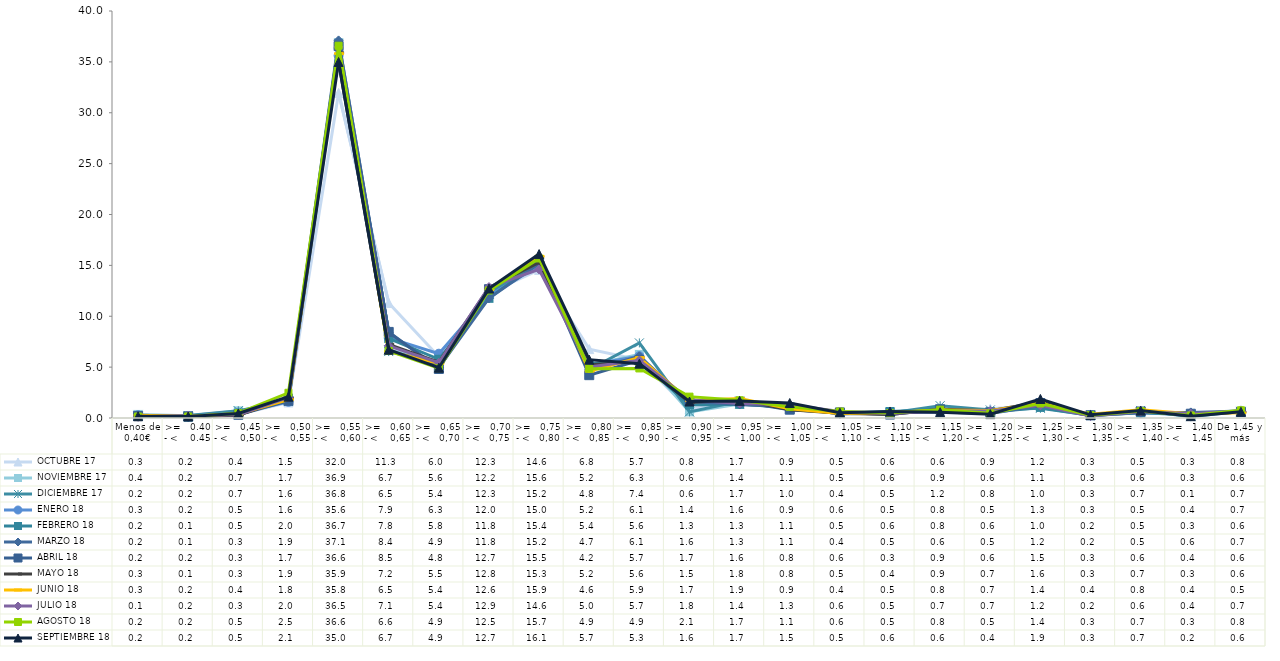
| Category |  OCTUBRE 17 |  NOVIEMBRE 17 |  DICIEMBRE 17 |  ENERO 18 |  FEBRERO 18 |  MARZO 18 |  ABRIL 18 |  MAYO 18 |  JUNIO 18 |  JULIO 18 |  AGOSTO 18 |  SEPTIEMBRE 18 |
|---|---|---|---|---|---|---|---|---|---|---|---|---|
| Menos de 0,40€ | 0.25 | 0.35 | 0.16 | 0.27 | 0.23 | 0.24 | 0.2 | 0.25 | 0.28 | 0.12 | 0.15 | 0.17 |
| >=   0.40 - <    0.45 | 0.22 | 0.21 | 0.24 | 0.17 | 0.08 | 0.1 | 0.16 | 0.11 | 0.17 | 0.22 | 0.15 | 0.15 |
| >=   0,45 - <    0,50 | 0.37 | 0.7 | 0.71 | 0.47 | 0.47 | 0.33 | 0.32 | 0.28 | 0.4 | 0.33 | 0.47 | 0.45 |
| >=   0,50 - <    0,55 | 1.53 | 1.68 | 1.63 | 1.59 | 1.95 | 1.9 | 1.69 | 1.94 | 1.81 | 2.02 | 2.48 | 2.09 |
| >=   0,55 - <    0,60 | 31.95 | 36.88 | 36.78 | 35.62 | 36.65 | 37.11 | 36.55 | 35.9 | 35.81 | 36.45 | 36.59 | 34.99 |
| >=   0,60 - <    0,65 | 11.31 | 6.69 | 6.53 | 7.87 | 7.82 | 8.37 | 8.46 | 7.24 | 6.54 | 7.09 | 6.6 | 6.71 |
| >=   0,65 - <   0,70 | 6.02 | 5.56 | 5.41 | 6.32 | 5.77 | 4.94 | 4.82 | 5.48 | 5.37 | 5.43 | 4.89 | 4.94 |
| >=   0,70 - <   0,75 | 12.29 | 12.24 | 12.31 | 12 | 11.76 | 11.77 | 12.66 | 12.8 | 12.63 | 12.87 | 12.53 | 12.72 |
| >=   0,75 - <   0,80 | 14.55 | 15.56 | 15.2 | 14.99 | 15.39 | 15.19 | 15.48 | 15.29 | 15.89 | 14.6 | 15.68 | 16.11 |
| >=   0,80 - <   0,85 | 6.77 | 5.19 | 4.77 | 5.21 | 5.36 | 4.73 | 4.21 | 5.24 | 4.61 | 5.02 | 4.85 | 5.73 |
| >=   0,85 - <   0,90 | 5.71 | 6.25 | 7.38 | 6.08 | 5.62 | 6.06 | 5.68 | 5.56 | 5.93 | 5.66 | 4.87 | 5.34 |
| >=   0,90 - <    0,95 | 0.83 | 0.6 | 0.6 | 1.37 | 1.29 | 1.62 | 1.67 | 1.52 | 1.71 | 1.79 | 2.1 | 1.62 |
| >=   0,95 - <   1,00 | 1.65 | 1.38 | 1.65 | 1.56 | 1.34 | 1.33 | 1.6 | 1.79 | 1.92 | 1.43 | 1.74 | 1.68 |
| >=   1,00 - <   1,05 | 0.87 | 1.09 | 0.95 | 0.9 | 1.06 | 1.09 | 0.82 | 0.81 | 0.91 | 1.3 | 1.1 | 1.47 |
| >=   1,05 - <    1,10 | 0.46 | 0.48 | 0.44 | 0.57 | 0.46 | 0.4 | 0.55 | 0.46 | 0.44 | 0.63 | 0.64 | 0.52 |
| >=   1,10 - <   1,15 | 0.55 | 0.56 | 0.49 | 0.51 | 0.64 | 0.52 | 0.34 | 0.35 | 0.54 | 0.45 | 0.48 | 0.64 |
| >=   1,15 - <    1,20 | 0.63 | 0.91 | 1.21 | 0.8 | 0.83 | 0.6 | 0.85 | 0.86 | 0.78 | 0.7 | 0.82 | 0.57 |
| >=   1,20 - <    1,25 | 0.91 | 0.64 | 0.79 | 0.52 | 0.57 | 0.45 | 0.55 | 0.71 | 0.73 | 0.69 | 0.46 | 0.38 |
| >=   1,25 - <    1,30 | 1.23 | 1.14 | 0.95 | 1.3 | 1.04 | 1.23 | 1.47 | 1.56 | 1.42 | 1.24 | 1.43 | 1.87 |
| >=   1,30 - <    1,35 | 0.33 | 0.34 | 0.28 | 0.3 | 0.24 | 0.21 | 0.26 | 0.28 | 0.37 | 0.2 | 0.28 | 0.31 |
| >=   1,35 - <    1,40 | 0.53 | 0.6 | 0.74 | 0.51 | 0.51 | 0.54 | 0.64 | 0.67 | 0.81 | 0.63 | 0.68 | 0.73 |
| >=   1,40 - <    1,45 | 0.25 | 0.32 | 0.13 | 0.37 | 0.32 | 0.55 | 0.42 | 0.31 | 0.42 | 0.43 | 0.25 | 0.18 |
| De 1,45 y más | 0.78 | 0.63 | 0.66 | 0.68 | 0.59 | 0.7 | 0.59 | 0.59 | 0.51 | 0.68 | 0.76 | 0.61 |